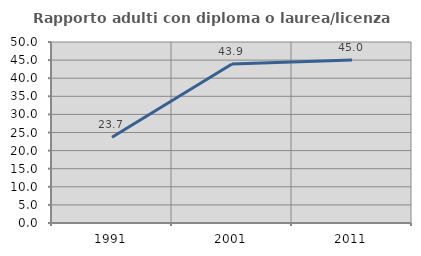
| Category | Rapporto adulti con diploma o laurea/licenza media  |
|---|---|
| 1991.0 | 23.699 |
| 2001.0 | 43.902 |
| 2011.0 | 45.022 |